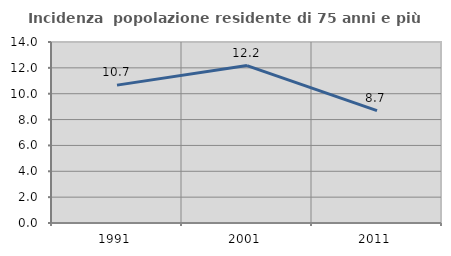
| Category | Incidenza  popolazione residente di 75 anni e più |
|---|---|
| 1991.0 | 10.664 |
| 2001.0 | 12.178 |
| 2011.0 | 8.696 |